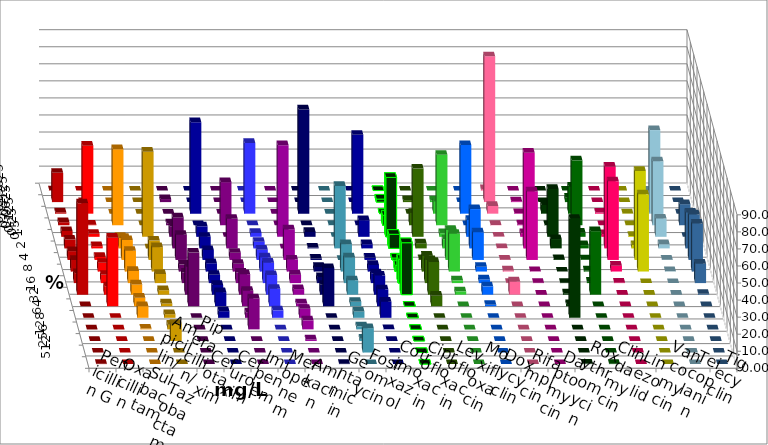
| Category | Penicillin G | Oxacillin | Ampicillin/ Sulbactam | Piperacillin/ Tazobactam | Cefotaxim | Cefuroxim | Imipenem | Meropenem | Amikacin | Gentamicin | Fosfomycin | Cotrimoxazol | Ciprofloxacin | Levofloxacin | Moxifloxacin | Doxycyclin | Rifampicin | Daptomycin | Roxythromycin | Clindamycin | Linezolid | Vancomycin | Teicoplanin | Tigecyclin |
|---|---|---|---|---|---|---|---|---|---|---|---|---|---|---|---|---|---|---|---|---|---|---|---|---|
| 0.015625 | 0.162 | 0 | 0 | 0 | 0 | 0 | 0 | 0 | 0 | 0 | 0 | 0 | 0 | 0 | 0 | 0 | 0.808 | 0 | 0 | 0 | 0 | 0 | 0 | 0 |
| 0.03125 | 17.152 | 0 | 0 | 0 | 1.783 | 0 | 0 | 0 | 0 | 0 | 0 | 0 | 1.783 | 1.138 | 0.968 | 0 | 85.46 | 0.486 | 0 | 2.568 | 0 | 0 | 0 | 0 |
| 0.0625 | 0.809 | 39.871 | 0 | 0 | 0 | 0 | 53.647 | 41.491 | 0 | 61.121 | 0 | 46.266 | 0.162 | 0 | 7.097 | 40.26 | 4.523 | 0.324 | 5.161 | 15.891 | 0.645 | 0.161 | 0 | 49.013 |
| 0.125 | 1.78 | 0.322 | 44.571 | 0 | 1.135 | 25.284 | 0 | 0 | 0 | 0 | 0.162 | 0 | 5.835 | 7.317 | 41.29 | 0 | 0.162 | 0.486 | 0.161 | 38.042 | 0 | 0 | 12.358 | 37.5 |
| 0.25 | 3.398 | 1.768 | 0 | 49.919 | 6.159 | 0 | 6.159 | 2.269 | 53.754 | 2.886 | 0 | 9.74 | 34.846 | 40 | 2.097 | 9.903 | 0.162 | 2.107 | 28.065 | 2.408 | 1.613 | 0.482 | 0 | 10.691 |
| 0.5 | 5.178 | 1.286 | 6.159 | 0 | 18.152 | 17.342 | 6.807 | 3.89 | 0 | 0.509 | 36.629 | 2.435 | 8.266 | 2.927 | 5.323 | 23.052 | 0.162 | 56.078 | 5.484 | 1.926 | 47.903 | 1.926 | 20.976 | 2.467 |
| 1.0 | 5.178 | 1.768 | 11.669 | 11.345 | 14.749 | 4.214 | 5.835 | 5.997 | 17.918 | 0.849 | 0 | 1.299 | 1.135 | 0.488 | 17.581 | 16.234 | 0.162 | 40.194 | 0.484 | 0.321 | 46.129 | 52.167 | 26.667 | 0.164 |
| 2.0 | 6.796 | 5.145 | 12.156 | 14.263 | 4.052 | 4.538 | 4.862 | 8.266 | 6.997 | 2.716 | 16.045 | 3.896 | 3.566 | 9.268 | 22.097 | 2.76 | 0.646 | 0.162 | 0 | 0.642 | 3.387 | 45.265 | 28.13 | 0.164 |
| 4.0 | 5.825 | 4.823 | 7.131 | 5.348 | 6.159 | 6.159 | 4.862 | 11.994 | 4.949 | 3.565 | 15.073 | 5.682 | 13.938 | 13.496 | 1.613 | 2.11 | 0.162 | 0.162 | 0.161 | 0.803 | 0.323 | 0 | 11.382 | 0 |
| 8.0 | 53.56 | 4.823 | 5.997 | 2.593 | 16.37 | 11.994 | 5.673 | 11.507 | 3.242 | 5.772 | 8.428 | 11.201 | 30.47 | 19.187 | 1.935 | 4.87 | 7.754 | 0 | 0.806 | 37.239 | 0 | 0 | 0.488 | 0 |
| 16.0 | 0 | 40.193 | 5.024 | 1.621 | 31.442 | 9.076 | 8.266 | 10.211 | 1.706 | 22.411 | 2.593 | 9.903 | 0 | 6.179 | 0 | 0.812 | 0 | 0 | 1.29 | 0 | 0 | 0 | 0 | 0 |
| 32.0 | 0 | 0 | 6.807 | 2.107 | 0 | 3.241 | 3.89 | 4.376 | 5.29 | 0 | 3.728 | 9.416 | 0 | 0 | 0 | 0 | 0 | 0 | 58.065 | 0 | 0 | 0 | 0 | 0 |
| 64.0 | 0 | 0 | 0.486 | 2.755 | 0 | 18.152 | 0 | 0 | 5.29 | 0 | 1.783 | 0.162 | 0 | 0 | 0 | 0 | 0 | 0 | 0 | 0 | 0 | 0 | 0 | 0 |
| 128.0 | 0 | 0 | 0 | 10.049 | 0 | 0 | 0 | 0 | 0.853 | 0 | 1.297 | 0 | 0 | 0 | 0 | 0 | 0 | 0 | 0 | 0 | 0 | 0 | 0 | 0 |
| 256.0 | 0 | 0 | 0 | 0 | 0 | 0 | 0 | 0 | 0 | 0 | 14.263 | 0 | 0 | 0 | 0 | 0 | 0 | 0 | 0 | 0 | 0 | 0 | 0 | 0 |
| 512.0 | 0.162 | 0 | 0 | 0 | 0 | 0 | 0 | 0 | 0 | 0.17 | 0 | 0 | 0 | 0 | 0 | 0 | 0 | 0 | 0.323 | 0.161 | 0 | 0 | 0 | 0 |